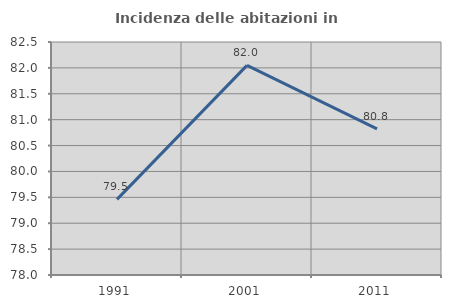
| Category | Incidenza delle abitazioni in proprietà  |
|---|---|
| 1991.0 | 79.46 |
| 2001.0 | 82.048 |
| 2011.0 | 80.822 |